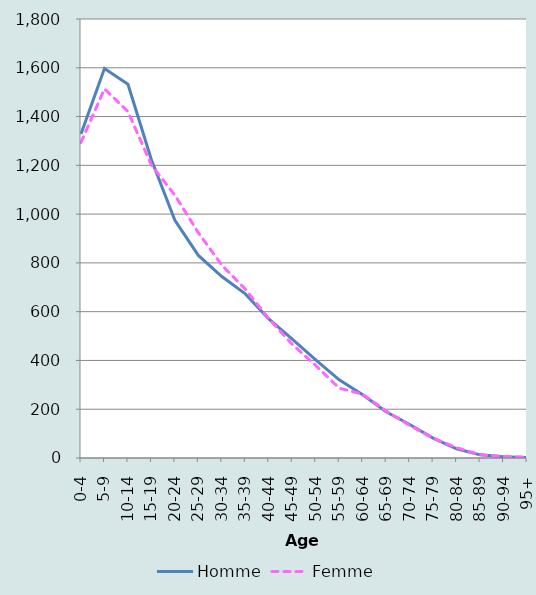
| Category | Homme | Femme |
|---|---|---|
| 0-4 | 1328865.2 | 1293907.24 |
| 5-9 | 1596953.6 | 1513337.8 |
| 10-14 | 1532675.9 | 1420330.7 |
| 15-19 | 1222766.32 | 1201331.58 |
| 20-24 | 974703.2 | 1077286.8 |
| 25-29 | 830518.72 | 923481.79 |
| 30-34 | 744101.44 | 790723.87 |
| 35-39 | 672943.07 | 692219.3 |
| 40-44 | 570156.82 | 571381.35 |
| 45-49 | 487378.01 | 465934.483 |
| 50-54 | 402819.662 | 379296.92 |
| 55-59 | 320358.03 | 286219.3 |
| 60-64 | 258925.86 | 261586.561 |
| 65-69 | 189802.641 | 192472.042 |
| 70-74 | 137206.94 | 133586.031 |
| 75-79 | 81316.3 | 81474.882 |
| 80-84 | 37627.511 | 42243.95 |
| 85-89 | 12915.46 | 13479.3 |
| 90-94 | 4942.41 | 5911.51 |
| 95+ | 1964.63 | 3242.08 |